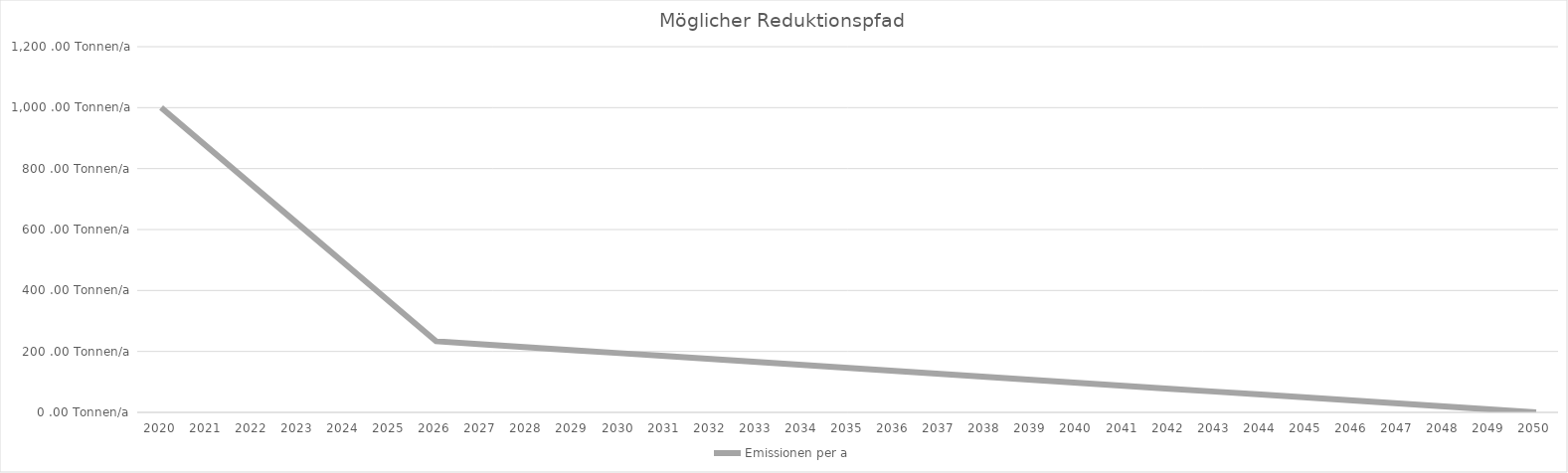
| Category | Emissionen per a |
|---|---|
| 2020.0 | 1000 |
| 2021.0 | 872.222 |
| 2022.0 | 744.444 |
| 2023.0 | 616.667 |
| 2024.0 | 488.889 |
| 2025.0 | 361.111 |
| 2026.0 | 233.333 |
| 2027.0 | 223.611 |
| 2028.0 | 213.889 |
| 2029.0 | 204.167 |
| 2030.0 | 194.444 |
| 2031.0 | 184.722 |
| 2032.0 | 175 |
| 2033.0 | 165.278 |
| 2034.0 | 155.556 |
| 2035.0 | 145.833 |
| 2036.0 | 136.111 |
| 2037.0 | 126.389 |
| 2038.0 | 116.667 |
| 2039.0 | 106.944 |
| 2040.0 | 97.222 |
| 2041.0 | 87.5 |
| 2042.0 | 77.778 |
| 2043.0 | 68.056 |
| 2044.0 | 58.333 |
| 2045.0 | 48.611 |
| 2046.0 | 38.889 |
| 2047.0 | 29.167 |
| 2048.0 | 19.444 |
| 2049.0 | 9.722 |
| 2050.0 | 0 |